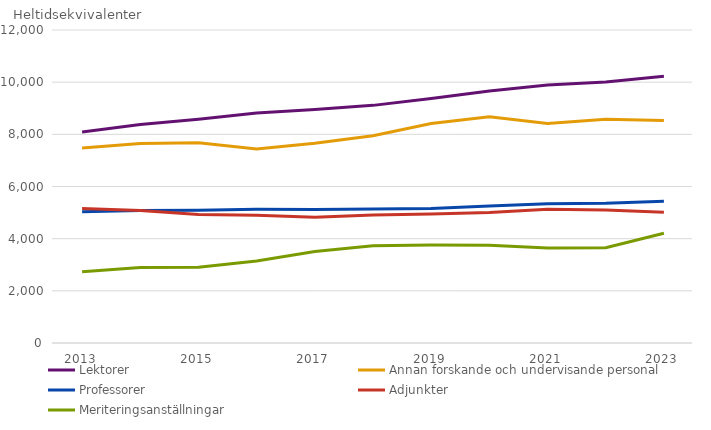
| Category | Lektorer | Annan forskande och undervisande personal | Professorer | Adjunkter | Meriteringsanställningar |
|---|---|---|---|---|---|
| 2013 | 8091.11 | 7478.98 | 5028.68 | 5154.32 | 2734.24 |
| 2014 | 8377.99 | 7650.86 | 5075.1 | 5080.62 | 2891.52 |
| 2015 | 8581.11 | 7681.02 | 5089 | 4923.36 | 2904.95 |
| 2016 | 8815.78 | 7438.65 | 5123.05 | 4899.6 | 3142.9 |
| 2017 | 8954.41 | 7655.52 | 5118.38 | 4817.74 | 3503.95 |
| 2018 | 9110.46 | 7947.61 | 5140.68 | 4907.07 | 3729.14 |
| 2019 | 9378.14 | 8417.08 | 5159.39 | 4950.37 | 3755.29 |
| 2020 | 9660.25 | 8673.26 | 5251.84 | 5003.13 | 3746.93 |
| 2021 | 9889.81 | 8417.32 | 5343.02 | 5131.63 | 3638.98 |
| 2022 | 10010.31 | 8581.5 | 5357.92 | 5100.74 | 3655.83 |
| 2023 | 10229 | 8528 | 5431 | 5011 | 4207 |